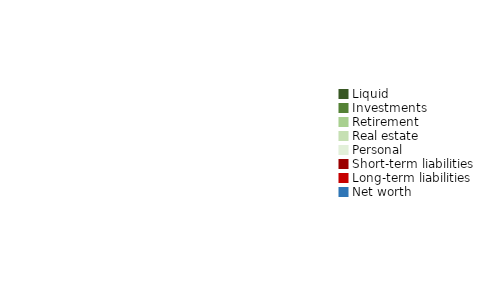
| Category | Net worth breakdown |
|---|---|
| 0 | 0 |
| 1 | 0 |
| 2 | 0 |
| 3 | 0 |
| 4 | 0 |
| 5 | 0 |
| 6 | 0 |
| 7 | 0 |